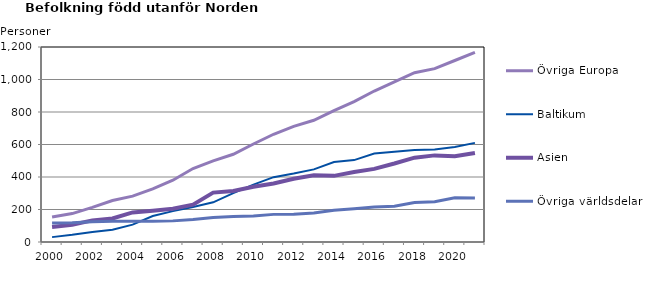
| Category | Övriga Europa | Baltikum | Asien | Övriga världsdelar |
|---|---|---|---|---|
| 2000 | 154 | 30 | 93 | 117 |
| 2001 | 175 | 44 | 106 | 118 |
| 2002 | 213 | 61 | 133 | 124 |
| 2003 | 255 | 76 | 145 | 128 |
| 2004 | 282 | 107 | 182 | 128 |
| 2005 | 327 | 160 | 193 | 127 |
| 2006 | 380 | 190 | 205 | 130 |
| 2007 | 452 | 216 | 230 | 138 |
| 2008 | 499 | 244 | 304 | 151 |
| 2009 | 540 | 301 | 314 | 157 |
| 2010 | 603 | 353 | 340 | 160 |
| 2011 | 663 | 399 | 360 | 170 |
| 2012 | 712 | 421 | 389 | 171 |
| 2013 | 749 | 447 | 411 | 178 |
| 2014 | 808 | 492 | 407 | 195 |
| 2015 | 864 | 504 | 431 | 205 |
| 2016 | 929 | 544 | 450 | 215 |
| 2017 | 985 | 556 | 483 | 220 |
| 2018 | 1042 | 566 | 519 | 243 |
| 2019 | 1067 | 569 | 533 | 248 |
| 2020 | 1117 | 585 | 528 | 272 |
| 2021 | 1167 | 610 | 548 | 271 |